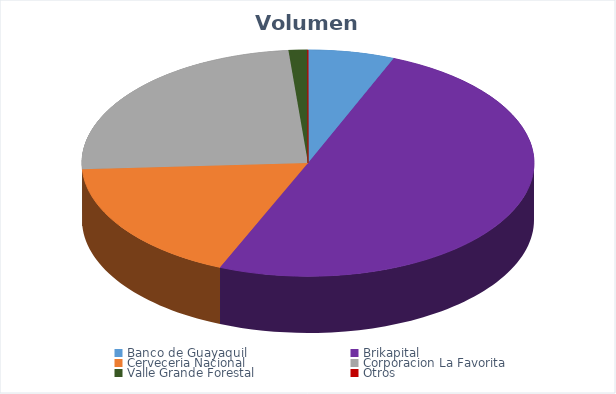
| Category | VOLUMEN ($USD) |
|---|---|
| Banco de Guayaquil | 36941.6 |
| Brikapital | 300000 |
| Cerveceria Nacional | 106260 |
| Corporacion La Favorita | 146389.88 |
| Valle Grande Forestal | 8000.2 |
| Otros | 232.44 |